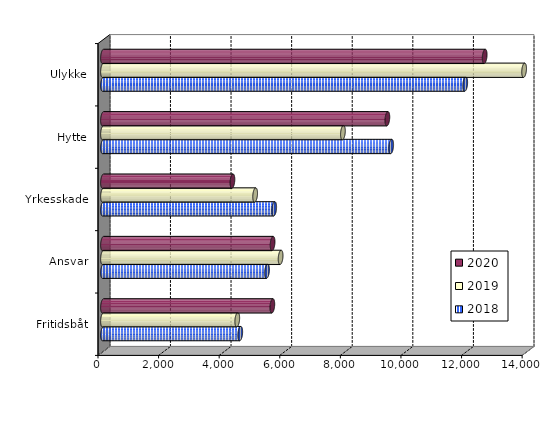
| Category | 2018 | 2019 | 2020 |
|---|---|---|---|
| Fritidsbåt | 4529.924 | 4431.519 | 5589.244 |
| Ansvar | 5414.37 | 5862.388 | 5597.337 |
| Yrkesskade | 5650.922 | 5021.556 | 4272.127 |
| Hytte | 9512.477 | 7919.316 | 9385.896 |
| Ulykke | 11956.072 | 13899.585 | 12597.658 |